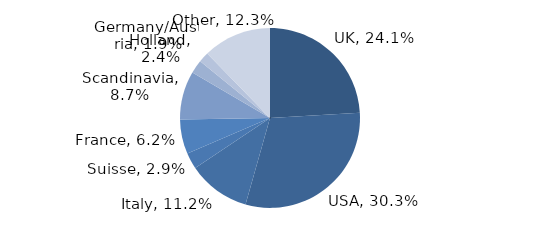
| Category | Investment Style |
|---|---|
| UK | 0.241 |
| USA | 0.303 |
| Italy | 0.112 |
| Suisse | 0.029 |
| France | 0.062 |
| Scandinavia | 0.087 |
| Holland | 0.024 |
| Germany/Austria | 0.019 |
| Other | 0.123 |